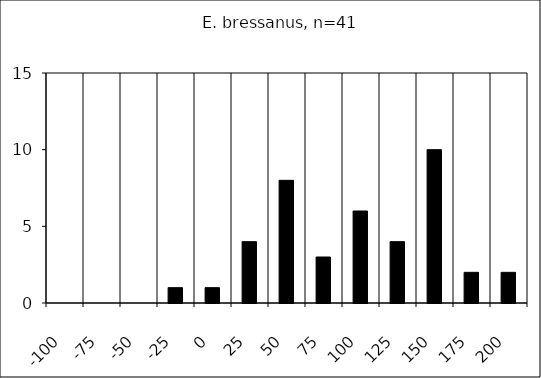
| Category | E. bressanus, n=41 |
|---|---|
| -100.0 | 0 |
| -75.0 | 0 |
| -50.0 | 0 |
| -25.0 | 1 |
| 0.0 | 1 |
| 25.0 | 4 |
| 50.0 | 8 |
| 75.0 | 3 |
| 100.0 | 6 |
| 125.0 | 4 |
| 150.0 | 10 |
| 175.0 | 2 |
| 200.0 | 2 |